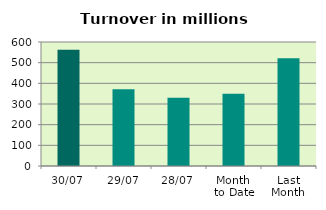
| Category | Series 0 |
|---|---|
| 30/07 | 562.888 |
| 29/07 | 371.599 |
| 28/07 | 330.029 |
| Month 
to Date | 349.651 |
| Last
Month | 521.023 |